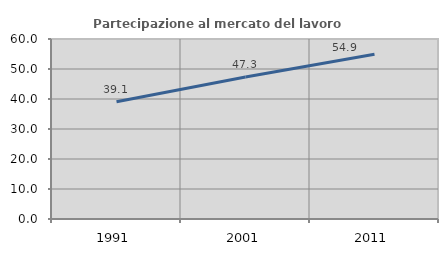
| Category | Partecipazione al mercato del lavoro  femminile |
|---|---|
| 1991.0 | 39.106 |
| 2001.0 | 47.327 |
| 2011.0 | 54.918 |